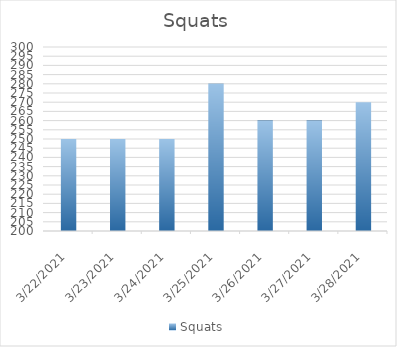
| Category | Squats |
|---|---|
| 3/22/21 | 250 |
| 3/23/21 | 250 |
| 3/24/21 | 250 |
| 3/25/21 | 280 |
| 3/26/21 | 260 |
| 3/27/21 | 260 |
| 3/28/21 | 270 |